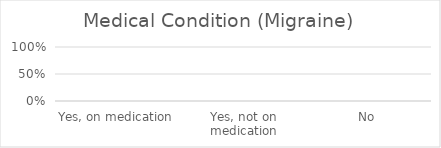
| Category | Migraine |
|---|---|
| Yes, on medication | 0 |
| Yes, not on medication | 0 |
| No | 0 |